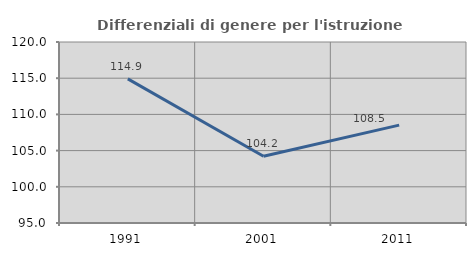
| Category | Differenziali di genere per l'istruzione superiore |
|---|---|
| 1991.0 | 114.9 |
| 2001.0 | 104.222 |
| 2011.0 | 108.52 |